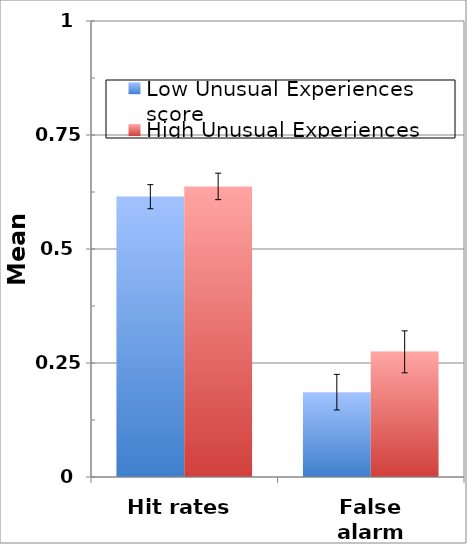
| Category | Low Unusual Experiences score | High Unusual Experiences score |
|---|---|---|
| Hit rates | 0.615 | 0.637 |
| False alarm rates | 0.186 | 0.275 |